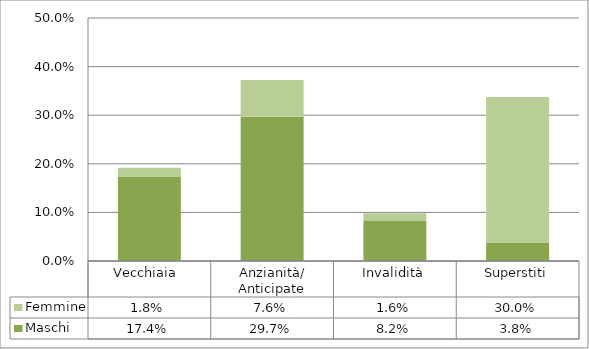
| Category | Maschi | Femmine |
|---|---|---|
| Vecchiaia  | 0.174 | 0.018 |
| Anzianità/ Anticipate | 0.297 | 0.076 |
| Invalidità | 0.082 | 0.016 |
| Superstiti | 0.038 | 0.3 |